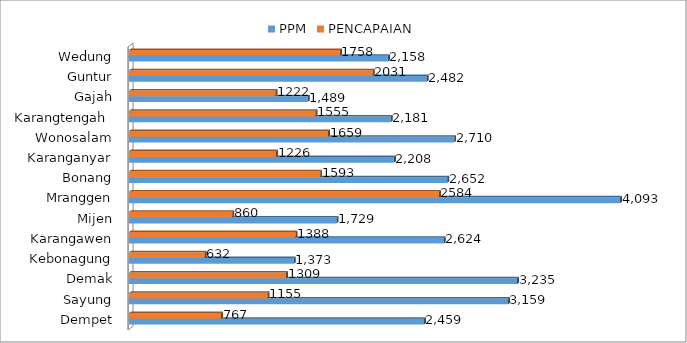
| Category | PPM | PENCAPAIAN |
|---|---|---|
| Dempet | 2459 | 767 |
| Sayung | 3159 | 1155 |
| Demak | 3235 | 1309 |
| Kebonagung | 1373 | 632 |
| Karangawen | 2624 | 1388 |
| Mijen | 1729 | 860 |
| Mranggen | 4093 | 2584 |
| Bonang | 2652 | 1593 |
| Karanganyar | 2208 | 1226 |
| Wonosalam | 2710 | 1659 |
| Karangtengah  | 2181 | 1555 |
| Gajah | 1489 | 1222 |
| Guntur | 2482 | 2031 |
| Wedung | 2158 | 1758 |